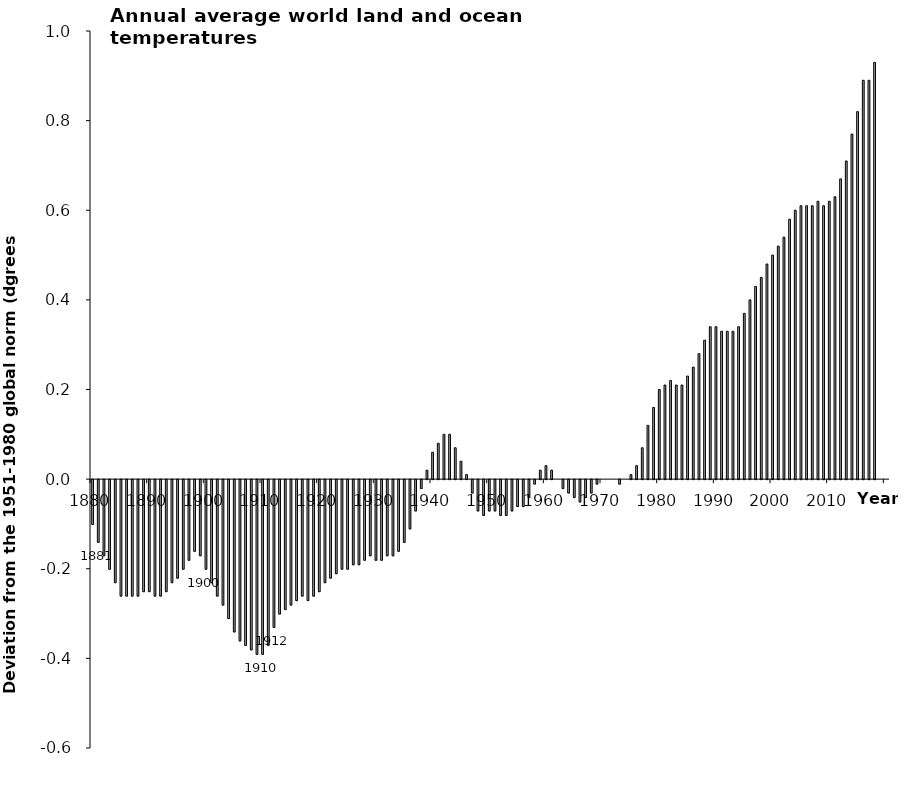
| Category | Series 0 |
|---|---|
| 1880.0 | -0.1 |
| 1881.0 | -0.14 |
| 1882.0 | -0.17 |
| 1883.0 | -0.2 |
| 1884.0 | -0.23 |
| 1885.0 | -0.26 |
| 1886.0 | -0.26 |
| 1887.0 | -0.26 |
| 1888.0 | -0.26 |
| 1889.0 | -0.25 |
| 1890.0 | -0.25 |
| 1891.0 | -0.26 |
| 1892.0 | -0.26 |
| 1893.0 | -0.25 |
| 1894.0 | -0.23 |
| 1895.0 | -0.22 |
| 1896.0 | -0.2 |
| 1897.0 | -0.18 |
| 1898.0 | -0.16 |
| 1899.0 | -0.17 |
| 1900.0 | -0.2 |
| 1901.0 | -0.23 |
| 1902.0 | -0.26 |
| 1903.0 | -0.28 |
| 1904.0 | -0.31 |
| 1905.0 | -0.34 |
| 1906.0 | -0.36 |
| 1907.0 | -0.37 |
| 1908.0 | -0.38 |
| 1909.0 | -0.39 |
| 1910.0 | -0.39 |
| 1911.0 | -0.37 |
| 1912.0 | -0.33 |
| 1913.0 | -0.3 |
| 1914.0 | -0.29 |
| 1915.0 | -0.28 |
| 1916.0 | -0.27 |
| 1917.0 | -0.26 |
| 1918.0 | -0.27 |
| 1919.0 | -0.26 |
| 1920.0 | -0.25 |
| 1921.0 | -0.23 |
| 1922.0 | -0.22 |
| 1923.0 | -0.21 |
| 1924.0 | -0.2 |
| 1925.0 | -0.2 |
| 1926.0 | -0.19 |
| 1927.0 | -0.19 |
| 1928.0 | -0.18 |
| 1929.0 | -0.17 |
| 1930.0 | -0.18 |
| 1931.0 | -0.18 |
| 1932.0 | -0.17 |
| 1933.0 | -0.17 |
| 1934.0 | -0.16 |
| 1935.0 | -0.14 |
| 1936.0 | -0.11 |
| 1937.0 | -0.07 |
| 1938.0 | -0.02 |
| 1939.0 | 0.02 |
| 1940.0 | 0.06 |
| 1941.0 | 0.08 |
| 1942.0 | 0.1 |
| 1943.0 | 0.1 |
| 1944.0 | 0.07 |
| 1945.0 | 0.04 |
| 1946.0 | 0.01 |
| 1947.0 | -0.03 |
| 1948.0 | -0.07 |
| 1949.0 | -0.08 |
| 1950.0 | -0.07 |
| 1951.0 | -0.07 |
| 1952.0 | -0.08 |
| 1953.0 | -0.08 |
| 1954.0 | -0.07 |
| 1955.0 | -0.06 |
| 1956.0 | -0.06 |
| 1957.0 | -0.04 |
| 1958.0 | -0.01 |
| 1959.0 | 0.02 |
| 1960.0 | 0.03 |
| 1961.0 | 0.02 |
| 1962.0 | 0 |
| 1963.0 | -0.02 |
| 1964.0 | -0.03 |
| 1965.0 | -0.04 |
| 1966.0 | -0.05 |
| 1967.0 | -0.04 |
| 1968.0 | -0.03 |
| 1969.0 | -0.01 |
| 1970.0 | 0 |
| 1971.0 | 0 |
| 1972.0 | 0 |
| 1973.0 | -0.01 |
| 1974.0 | 0 |
| 1975.0 | 0.01 |
| 1976.0 | 0.03 |
| 1977.0 | 0.07 |
| 1978.0 | 0.12 |
| 1979.0 | 0.16 |
| 1980.0 | 0.2 |
| 1981.0 | 0.21 |
| 1982.0 | 0.22 |
| 1983.0 | 0.21 |
| 1984.0 | 0.21 |
| 1985.0 | 0.23 |
| 1986.0 | 0.25 |
| 1987.0 | 0.28 |
| 1988.0 | 0.31 |
| 1989.0 | 0.34 |
| 1990.0 | 0.34 |
| 1991.0 | 0.33 |
| 1992.0 | 0.33 |
| 1993.0 | 0.33 |
| 1994.0 | 0.34 |
| 1995.0 | 0.37 |
| 1996.0 | 0.4 |
| 1997.0 | 0.43 |
| 1998.0 | 0.45 |
| 1999.0 | 0.48 |
| 2000.0 | 0.5 |
| 2001.0 | 0.52 |
| 2002.0 | 0.54 |
| 2003.0 | 0.58 |
| 2004.0 | 0.6 |
| 2005.0 | 0.61 |
| 2006.0 | 0.61 |
| 2007.0 | 0.61 |
| 2008.0 | 0.62 |
| 2009.0 | 0.61 |
| 2010.0 | 0.62 |
| 2011.0 | 0.63 |
| 2012.0 | 0.67 |
| 2013.0 | 0.71 |
| 2014.0 | 0.77 |
| 2015.0 | 0.82 |
| 2016.0 | 0.89 |
| 2017.0 | 0.89 |
| 2018.0 | 0.93 |